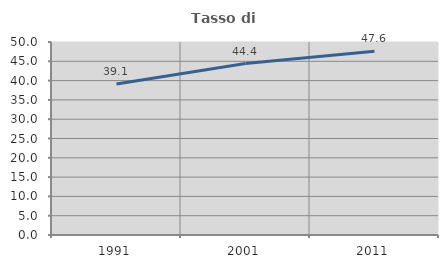
| Category | Tasso di occupazione   |
|---|---|
| 1991.0 | 39.144 |
| 2001.0 | 44.42 |
| 2011.0 | 47.607 |